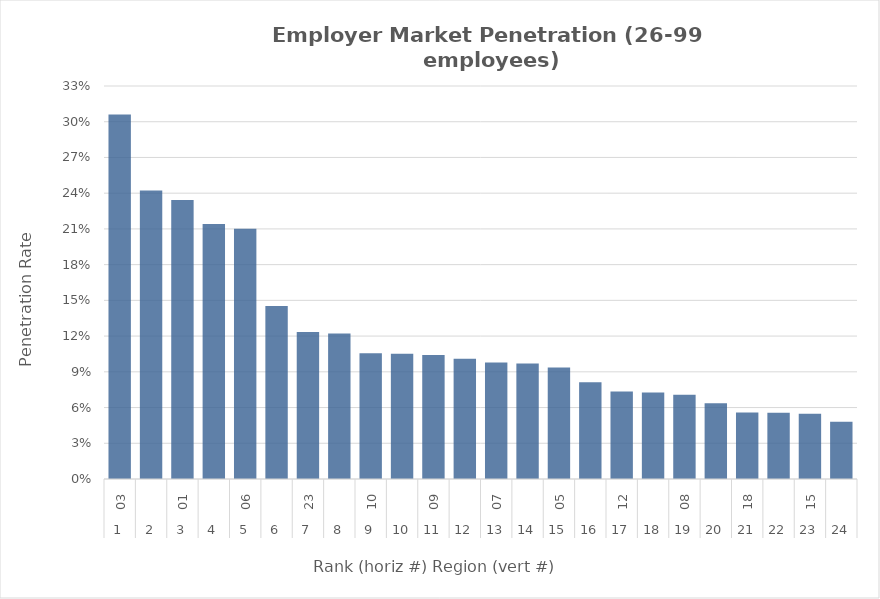
| Category | Rate |
|---|---|
| 0 | 0.306 |
| 1 | 0.242 |
| 2 | 0.234 |
| 3 | 0.214 |
| 4 | 0.21 |
| 5 | 0.145 |
| 6 | 0.123 |
| 7 | 0.122 |
| 8 | 0.106 |
| 9 | 0.105 |
| 10 | 0.104 |
| 11 | 0.101 |
| 12 | 0.098 |
| 13 | 0.097 |
| 14 | 0.094 |
| 15 | 0.081 |
| 16 | 0.073 |
| 17 | 0.073 |
| 18 | 0.071 |
| 19 | 0.064 |
| 20 | 0.056 |
| 21 | 0.056 |
| 22 | 0.055 |
| 23 | 0.048 |